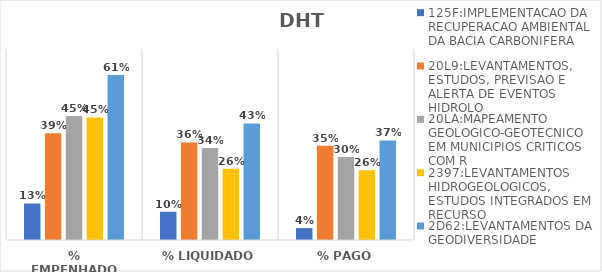
| Category | 125F:IMPLEMENTACAO DA RECUPERACAO AMBIENTAL DA BACIA CARBONIFERA | 20L9:LEVANTAMENTOS, ESTUDOS, PREVISAO E ALERTA DE EVENTOS HIDROLO | 20LA:MAPEAMENTO GEOLOGICO-GEOTECNICO EM MUNICIPIOS CRITICOS COM R | 2397:LEVANTAMENTOS HIDROGEOLOGICOS, ESTUDOS INTEGRADOS EM RECURSO | 2D62:LEVANTAMENTOS DA GEODIVERSIDADE |
|---|---|---|---|---|---|
| % EMPENHADO | 0.134 | 0.392 | 0.454 | 0.449 | 0.605 |
| % LIQUIDADO | 0.104 | 0.357 | 0.337 | 0.261 | 0.427 |
| % PAGO | 0.044 | 0.345 | 0.305 | 0.255 | 0.365 |